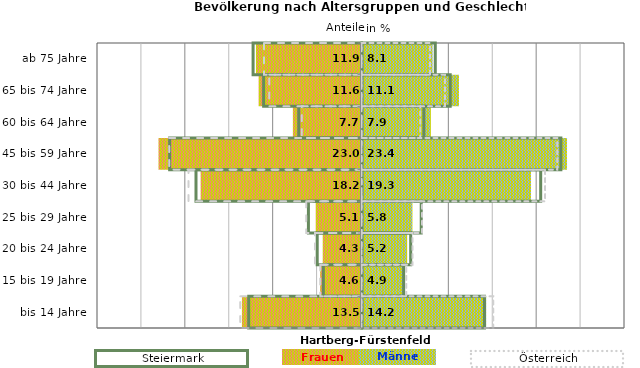
| Category | Frauen | Männer | Frauen Spalte2 | Männer Spalte2 | Frauen Spalte3 | Männer Spalte3 |
|---|---|---|---|---|---|---|
| bis 14 Jahre | -13.5 | 14.2 | 14 | -12.9 | -13.8 | 15 |
| 15 bis 19 Jahre | -4.6 | 4.9 | 4.8 | -4.4 | -4.7 | 5.1 |
| 20 bis 24 Jahre | -4.3 | 5.2 | 5.6 | -5.1 | -5.3 | 5.8 |
| 25 bis 29 Jahre | -5.1 | 5.8 | 6.8 | -6.1 | -6.3 | 6.9 |
| 30 bis 44 Jahre | -18.2 | 19.3 | 20.4 | -18.9 | -19.7 | 20.9 |
| 45 bis 59 Jahre | -23 | 23.4 | 22.7 | -21.9 | -21.9 | 22.3 |
| 60 bis 64 Jahre | -7.7 | 7.9 | 7.1 | -7.2 | -6.8 | 6.7 |
| 65 bis 74 Jahre | -11.6 | 11.1 | 10.1 | -11.2 | -10.5 | 9.5 |
| ab 75 Jahre | -11.9 | 8.1 | 8.4 | -12.4 | -11.1 | 7.8 |